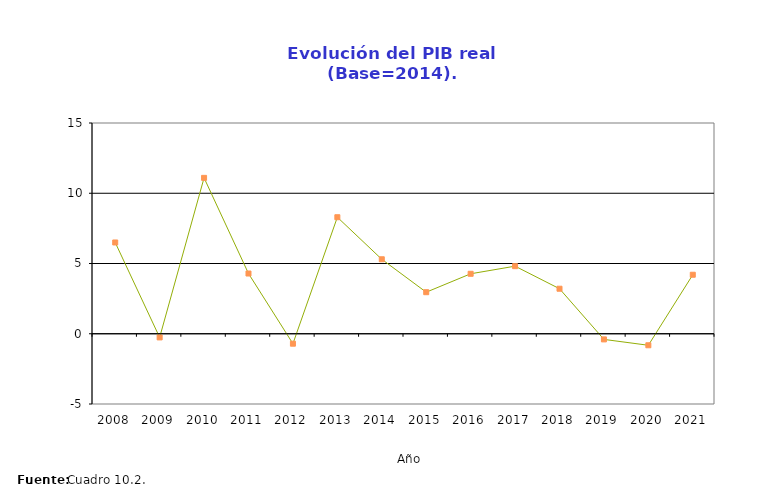
| Category | Evolución PIB real |
|---|---|
| 2008.0 | 6.496 |
| 2009.0 | -0.261 |
| 2010.0 | 11.095 |
| 2011.0 | 4.286 |
| 2012.0 | -0.708 |
| 2013.0 | 8.293 |
| 2014.0 | 5.301 |
| 2015.0 | 2.957 |
| 2016.0 | 4.268 |
| 2017.0 | 4.81 |
| 2018.0 | 3.204 |
| 2019.0 | -0.402 |
| 2020.0 | -0.82 |
| 2021.0 | 4.2 |